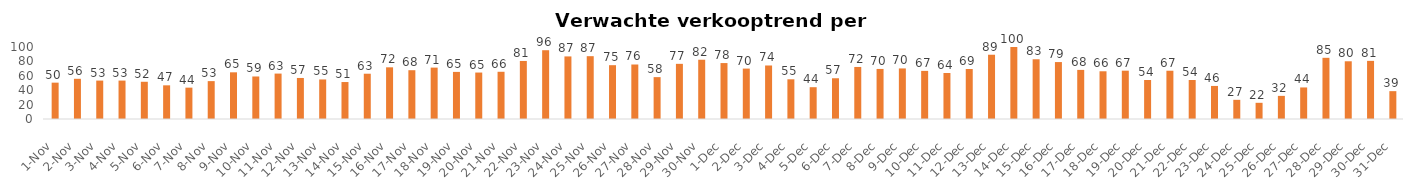
| Category | Series 1 |
|---|---|
| 2020-11-01 | 50.48 |
| 2020-11-02 | 55.83 |
| 2020-11-03 | 53.35 |
| 2020-11-04 | 53.37 |
| 2020-11-05 | 51.71 |
| 2020-11-06 | 46.77 |
| 2020-11-07 | 43.55 |
| 2020-11-08 | 52.61 |
| 2020-11-09 | 64.84 |
| 2020-11-10 | 59.05 |
| 2020-11-11 | 63.08 |
| 2020-11-12 | 56.99 |
| 2020-11-13 | 54.92 |
| 2020-11-14 | 51.34 |
| 2020-11-15 | 62.89 |
| 2020-11-16 | 71.78 |
| 2020-11-17 | 67.77 |
| 2020-11-18 | 71.38 |
| 2020-11-19 | 65.41 |
| 2020-11-20 | 64.52 |
| 2020-11-21 | 65.59 |
| 2020-11-22 | 80.61 |
| 2020-11-23 | 95.52 |
| 2020-11-24 | 86.91 |
| 2020-11-25 | 87.25 |
| 2020-11-26 | 74.74 |
| 2020-11-27 | 75.7 |
| 2020-11-28 | 58.15 |
| 2020-11-29 | 76.61 |
| 2020-11-30 | 82.33 |
| 2020-12-01 | 77.69 |
| 2020-12-02 | 70.02 |
| 2020-12-03 | 74.32 |
| 2020-12-04 | 55.15 |
| 2020-12-05 | 44.17 |
| 2020-12-06 | 56.6 |
| 2020-12-07 | 72.28 |
| 2020-12-08 | 69.53 |
| 2020-12-09 | 70.23 |
| 2020-12-10 | 66.82 |
| 2020-12-11 | 63.92 |
| 2020-12-12 | 69.43 |
| 2020-12-13 | 89.26 |
| 2020-12-14 | 100 |
| 2020-12-15 | 82.97 |
| 2020-12-16 | 79.07 |
| 2020-12-17 | 68.2 |
| 2020-12-18 | 66.28 |
| 2020-12-19 | 67.1 |
| 2020-12-20 | 54.16 |
| 2020-12-21 | 67.04 |
| 2020-12-22 | 54.16 |
| 2020-12-23 | 45.92 |
| 2020-12-24 | 26.62 |
| 2020-12-25 | 22.49 |
| 2020-12-26 | 32.11 |
| 2020-12-27 | 43.82 |
| 2020-12-28 | 84.98 |
| 2020-12-29 | 80.17 |
| 2020-12-30 | 80.73 |
| 2020-12-31 | 38.68 |